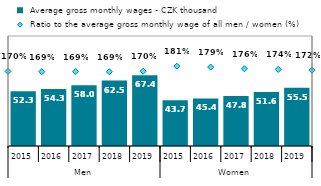
| Category |  Average gross monthly wages - CZK thousand |
|---|---|
| 0 | 52.296 |
| 1 | 54.325 |
| 2 | 58.025 |
| 3 | 62.46 |
| 4 | 67.439 |
| 5 | 43.701 |
| 6 | 45.369 |
| 7 | 47.765 |
| 8 | 51.55 |
| 9 | 55.512 |